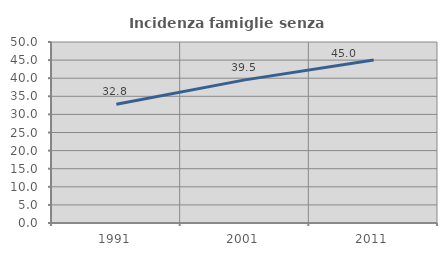
| Category | Incidenza famiglie senza nuclei |
|---|---|
| 1991.0 | 32.821 |
| 2001.0 | 39.535 |
| 2011.0 | 45 |